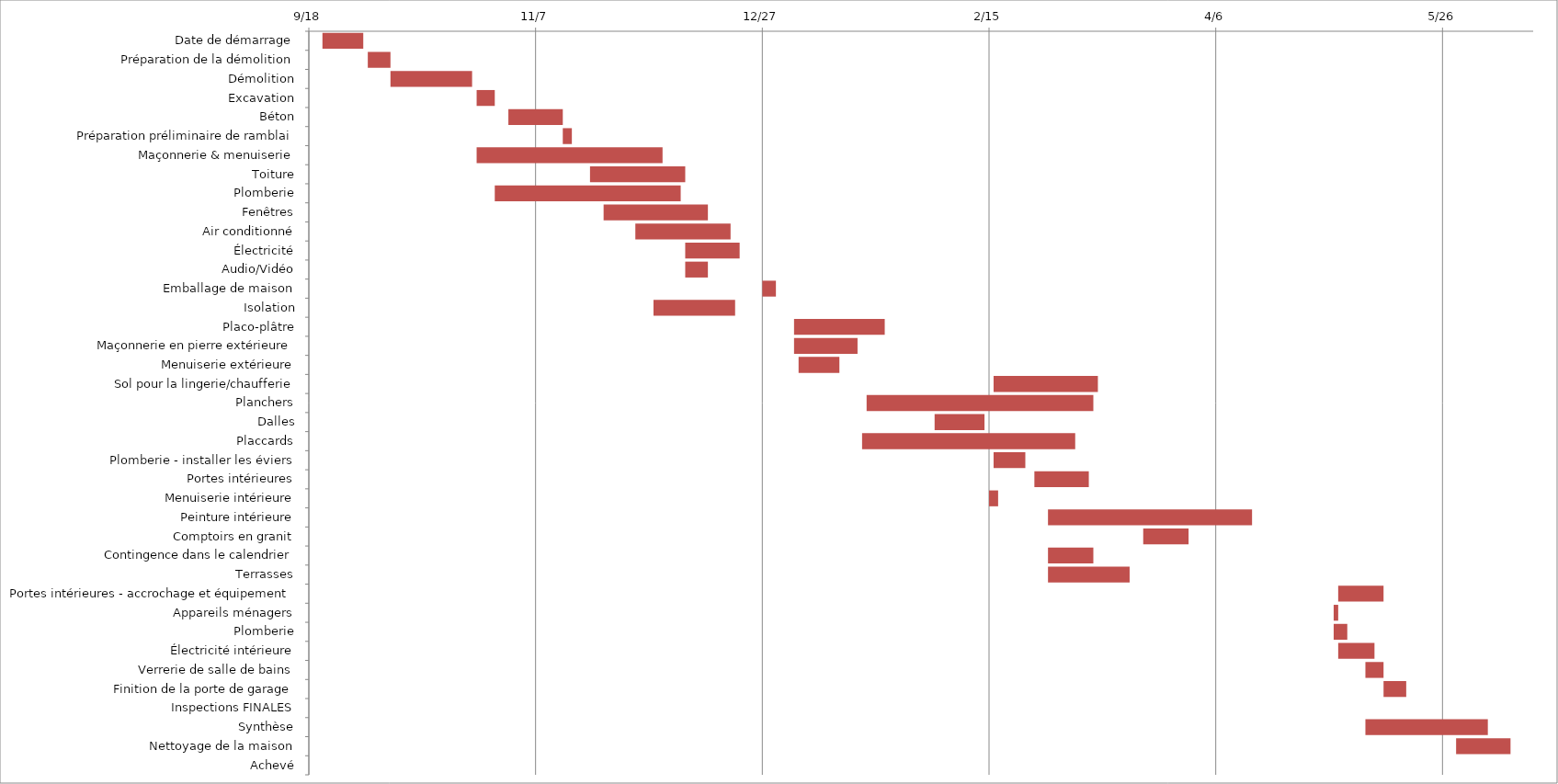
| Category | Start Date | Duration |
|---|---|---|
| Date de démarrage | 9/21/14 | 9 |
| Préparation de la démolition | 10/1/14 | 5 |
| Démolition | 10/6/14 | 18 |
| Excavation | 10/25/14 | 4 |
| Béton | 11/1/14 | 12 |
| Préparation préliminaire de ramblai | 11/13/14 | 2 |
| Maçonnerie & menuiserie | 10/25/14 | 41 |
| Toiture | 11/19/14 | 21 |
| Plomberie | 10/29/14 | 41 |
| Fenêtres | 11/22/14 | 23 |
| Air conditionné | 11/29/14 | 21 |
| Électricité | 12/10/14 | 12 |
| Audio/Vidéo | 12/10/14 | 5 |
| Emballage de maison | 12/27/14 | 3 |
| Isolation | 12/3/14 | 18 |
| Placo-plâtre | 1/3/15 | 20 |
| Maçonnerie en pierre extérieure | 1/3/15 | 14 |
| Menuiserie extérieure | 1/4/15 | 9 |
| Sol pour la lingerie/chaufferie | 2/16/15 | 23 |
| Planchers | 1/19/15 | 50 |
| Dalles | 2/3/15 | 11 |
| Placcards | 1/18/15 | 47 |
| Plomberie - installer les éviers | 2/16/15 | 7 |
| Portes intérieures | 2/25/15 | 12 |
| Menuiserie intérieure | 2/15/15 | 2 |
| Peinture intérieure | 2/28/15 | 45 |
| Comptoirs en granit | 3/21/15 | 10 |
| Contingence dans le calendrier | 2/28/15 | 10 |
| Terrasses | 2/28/15 | 18 |
| Portes intérieures - accrochage et équipement | 5/3/15 | 10 |
| Appareils ménagers | 5/2/15 | 1 |
| Plomberie | 5/2/15 | 3 |
| Électricité intérieure | 5/3/15 | 8 |
| Verrerie de salle de bains | 5/9/15 | 4 |
| Finition de la porte de garage | 5/13/15 | 5 |
| Inspections FINALES | 5/2/15 | 0 |
| Synthèse | 5/9/15 | 27 |
| Nettoyage de la maison | 5/29/15 | 12 |
| Achevé | 6/1/15 | 0 |